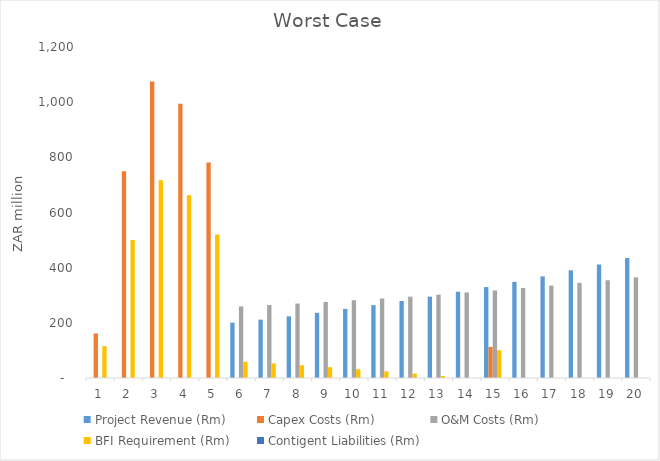
| Category | Project Revenue (Rm) | Capex Costs (Rm) | O&M Costs (Rm) | BFI Requirement (Rm) | Contigent Liabilities (Rm) |
|---|---|---|---|---|---|
| 0 | 0 | 161.4 | 0 | 115.608 | 0 |
| 1 | 0 | 750 | 0 | 500 | 0 |
| 2 | 0 | 1074.931 | 0 | 716.621 | 0 |
| 3 | 0 | 994.239 | 0 | 662.826 | 0 |
| 4 | 0 | 780.83 | 0 | 520.553 | 0 |
| 5 | 200.729 | 0 | 259.591 | 58.862 | 0 |
| 6 | 211.591 | 0 | 264.479 | 52.888 | 0 |
| 7 | 223.651 | 0 | 269.906 | 46.255 | 0 |
| 8 | 236.399 | 0 | 275.643 | 39.243 | 0 |
| 9 | 250.559 | 0 | 282.014 | 31.456 | 0 |
| 10 | 264.117 | 0 | 288.116 | 23.999 | 0 |
| 11 | 279.172 | 0 | 294.89 | 15.719 | 0 |
| 12 | 295.084 | 0 | 302.051 | 6.967 | 0 |
| 13 | 312.759 | 0 | 310.004 | 0 | 0 |
| 14 | 329.683 | 112.842 | 317.62 | 100.78 | 0 |
| 15 | 348.475 | 0 | 326.077 | 0 | 0 |
| 16 | 368.338 | 0 | 335.015 | 0 | 0 |
| 17 | 390.4 | 0 | 344.943 | 0 | 0 |
| 18 | 411.525 | 0 | 354.449 | 0 | 0 |
| 19 | 434.982 | 0 | 365.005 | 0 | 0 |